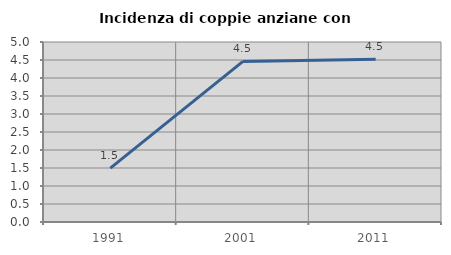
| Category | Incidenza di coppie anziane con figli |
|---|---|
| 1991.0 | 1.496 |
| 2001.0 | 4.461 |
| 2011.0 | 4.523 |